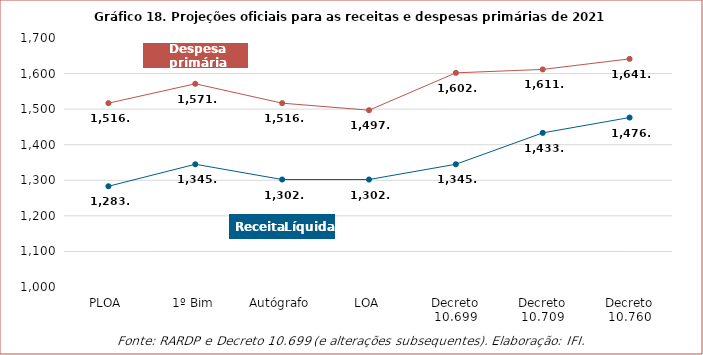
| Category | Receita líquida | Despesa primária |
|---|---|---|
| PLOA | 1283.232 | 1516.8 |
| 1º Bim | 1345.045 | 1571.283 |
| Autógrafo | 1302.136 | 1516.8 |
| LOA | 1302.136 | 1497.032 |
| Decreto 10.699 | 1345.045 | 1602.003 |
| Decreto 10.709 | 1433.271 | 1611.669 |
| Decreto 10.760 | 1476.384 | 1641.298 |